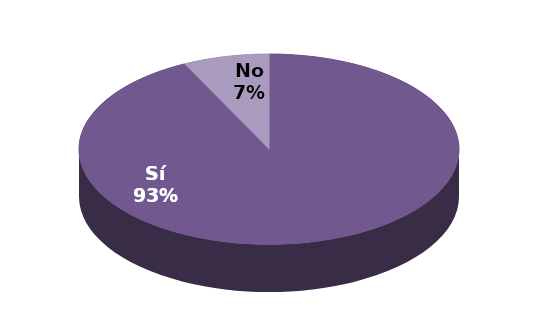
| Category | Series 1 |
|---|---|
| Sí | 139 |
| No | 11 |